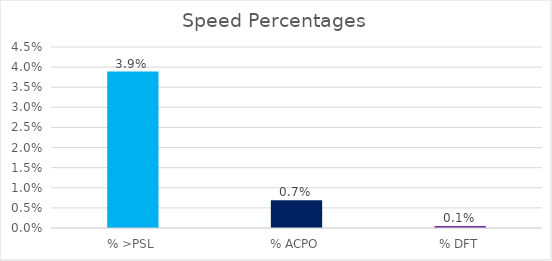
| Category | Series 0 |
|---|---|
| % >PSL | 0.039 |
| % ACPO | 0.007 |
| % DFT | 0.001 |